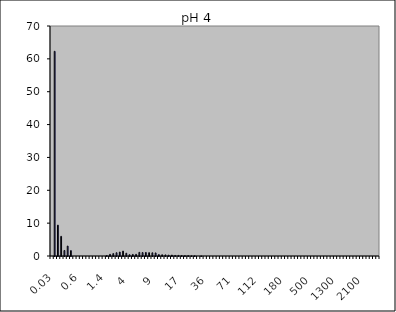
| Category | Magnetite pH 4 2Nb |
|---|---|
| 0.03 | 0 |
| 0.04 | 62.292 |
| 0.07 | 9.39 |
| 0.1 | 5.979 |
| 0.2 | 1.68 |
| 0.3 | 3.018 |
| 0.4 | 1.642 |
| 0.5 | 0 |
| 0.6 | 0 |
| 0.7 | 0 |
| 0.8 | 0 |
| 0.9 | 0 |
| 1.0 | 0 |
| 1.1 | 0 |
| 1.2 | 0 |
| 1.3 | 0 |
| 1.4 | 0 |
| 1.6 | 0.156 |
| 1.8 | 0.504 |
| 2.0 | 0.733 |
| 2.2 | 0.997 |
| 2.4 | 1.195 |
| 2.6 | 1.484 |
| 3.0 | 0.851 |
| 4.0 | 0.392 |
| 5.0 | 0.479 |
| 6.0 | 0.505 |
| 6.5 | 1.113 |
| 7.0 | 1.042 |
| 7.5 | 1.076 |
| 8.0 | 1.013 |
| 8.5 | 0.98 |
| 9.0 | 0.935 |
| 10.0 | 0.423 |
| 11.0 | 0.374 |
| 12.0 | 0.341 |
| 13.0 | 0.26 |
| 14.0 | 0.281 |
| 15.0 | 0.172 |
| 16.0 | 0.184 |
| 17.0 | 0.147 |
| 18.0 | 0.104 |
| 19.0 | 0.11 |
| 20.0 | 0.058 |
| 22.0 | 0.062 |
| 25.0 | 0 |
| 28.0 | 0.026 |
| 32.0 | 0 |
| 36.0 | 0 |
| 38.0 | 0 |
| 40.0 | 0 |
| 45.0 | 0 |
| 50.0 | 0 |
| 53.0 | 0 |
| 56.0 | 0 |
| 63.0 | 0 |
| 71.0 | 0 |
| 75.0 | 0 |
| 80.0 | 0 |
| 85.0 | 0 |
| 90.0 | 0 |
| 95.0 | 0 |
| 100.0 | 0 |
| 106.0 | 0 |
| 112.0 | 0 |
| 125.0 | 0 |
| 130.0 | 0 |
| 140.0 | 0 |
| 145.0 | 0 |
| 150.0 | 0 |
| 160.0 | 0 |
| 170.0 | 0 |
| 180.0 | 0 |
| 190.0 | 0 |
| 200.0 | 0 |
| 212.0 | 0 |
| 242.0 | 0 |
| 250.0 | 0 |
| 300.0 | 0 |
| 400.0 | 0 |
| 500.0 | 0 |
| 600.0 | 0 |
| 700.0 | 0 |
| 800.0 | 0 |
| 900.0 | 0 |
| 1000.0 | 0 |
| 1100.0 | 0 |
| 1200.0 | 0 |
| 1300.0 | 0 |
| 1400.0 | 0 |
| 1500.0 | 0 |
| 1600.0 | 0 |
| 1700.0 | 0 |
| 1800.0 | 0 |
| 1900.0 | 0 |
| 2000.0 | 0 |
| 2100.0 | 0 |
| 2200.0 | 0 |
| 2300.0 | 0 |
| 2400.0 | 0 |
| 2500.0 | 0 |